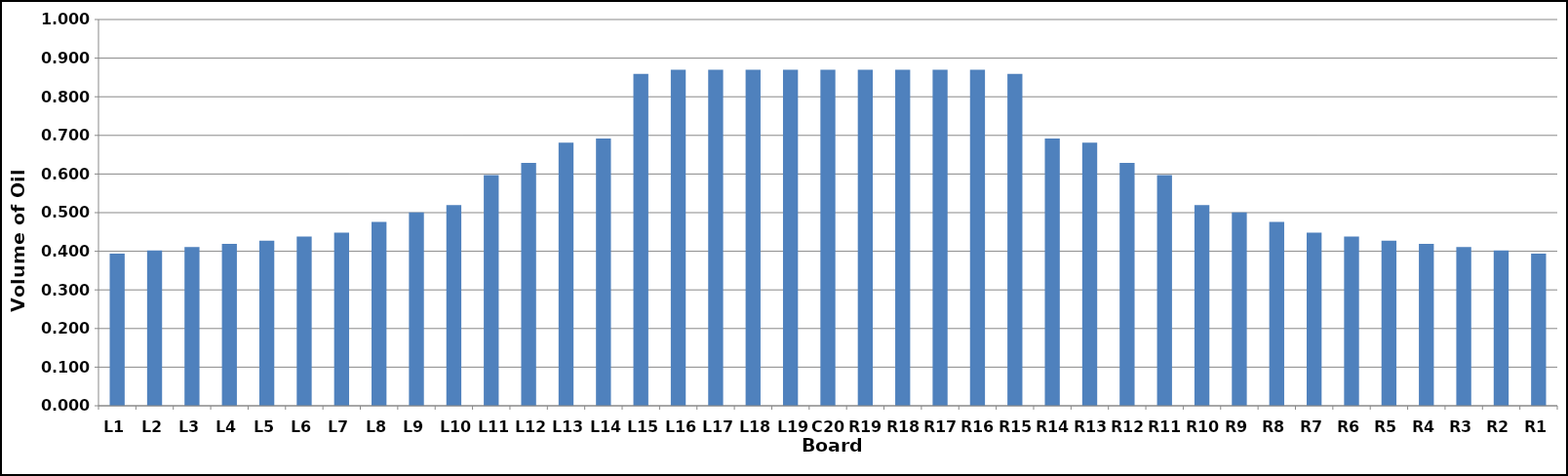
| Category | Series 0 |
|---|---|
| L1 | 0.394 |
| L2 | 0.402 |
| L3 | 0.411 |
| L4 | 0.419 |
| L5 | 0.428 |
| L6 | 0.438 |
| L7 | 0.449 |
| L8 | 0.476 |
| L9 | 0.501 |
| L10 | 0.52 |
| L11 | 0.597 |
| L12 | 0.629 |
| L13 | 0.681 |
| L14 | 0.692 |
| L15 | 0.859 |
| L16 | 0.87 |
| L17 | 0.87 |
| L18 | 0.87 |
| L19 | 0.87 |
| C20 | 0.87 |
| R19 | 0.87 |
| R18 | 0.87 |
| R17 | 0.87 |
| R16 | 0.87 |
| R15 | 0.859 |
| R14 | 0.692 |
| R13 | 0.681 |
| R12 | 0.629 |
| R11 | 0.597 |
| R10 | 0.52 |
| R9 | 0.501 |
| R8 | 0.476 |
| R7 | 0.449 |
| R6 | 0.438 |
| R5 | 0.428 |
| R4 | 0.419 |
| R3 | 0.411 |
| R2 | 0.402 |
| R1 | 0.394 |